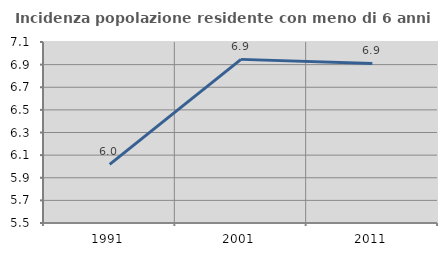
| Category | Incidenza popolazione residente con meno di 6 anni |
|---|---|
| 1991.0 | 6.019 |
| 2001.0 | 6.946 |
| 2011.0 | 6.91 |